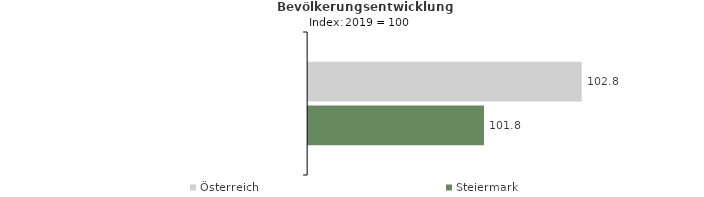
| Category | Österreich | Steiermark |
|---|---|---|
| 2023.0 | 102.8 | 101.8 |